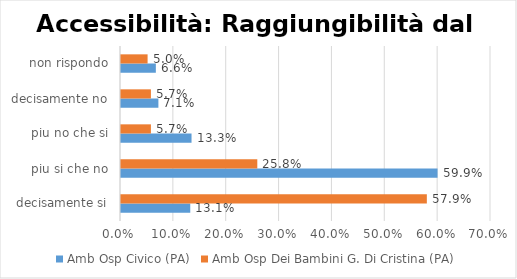
| Category | Amb Osp Civico (PA) | Amb Osp Dei Bambini G. Di Cristina (PA) |
|---|---|---|
| decisamente si | 0.131 | 0.579 |
| piu si che no | 0.599 | 0.258 |
| piu no che si | 0.133 | 0.057 |
| decisamente no | 0.071 | 0.057 |
| non rispondo | 0.066 | 0.05 |